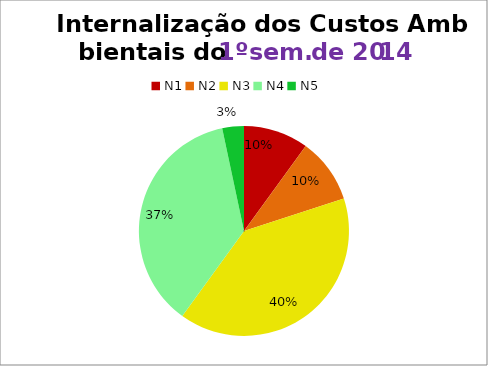
| Category | 1º/14 |
|---|---|
| N1 | 3 |
| N2 | 3 |
| N3 | 12 |
| N4 | 11 |
| N5 | 1 |